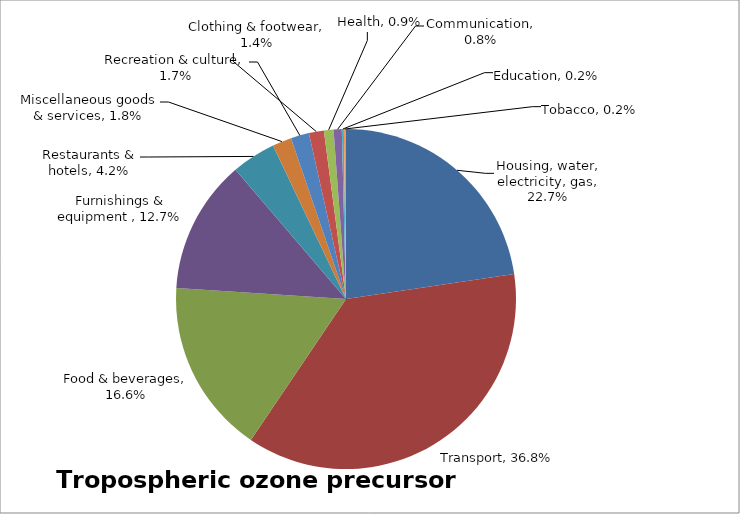
| Category | Tropospheric ozone precursor emissions |
|---|---|
| Housing, water, electricity, gas | 0.227 |
| Transport | 0.368 |
| Food & beverages | 0.166 |
| Furnishings & equipment  | 0.127 |
| Restaurants & hotels | 0.042 |
| Miscellaneous goods & services | 0.018 |
| Recreation & culture | 0.017 |
| Clothing & footwear | 0.014 |
| Health | 0.009 |
| Communication | 0.008 |
| Education | 0.002 |
| Tobacco | 0.002 |